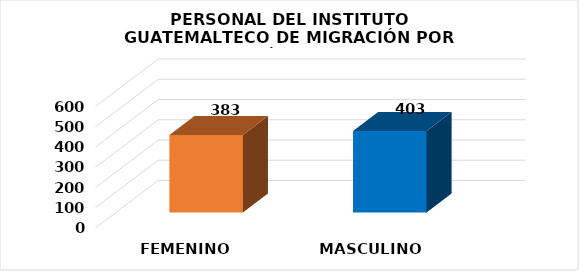
| Category | Series 0 |
|---|---|
| FEMENINO | 383 |
| MASCULINO | 403 |